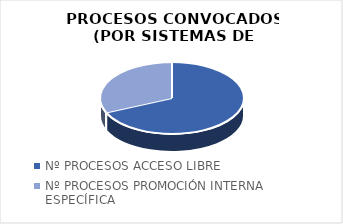
| Category | Series 0 |
|---|---|
| Nº PROCESOS ACCESO LIBRE | 41 |
| Nº PROCESOS PROMOCIÓN INTERNA ESPECÍFICA | 19 |